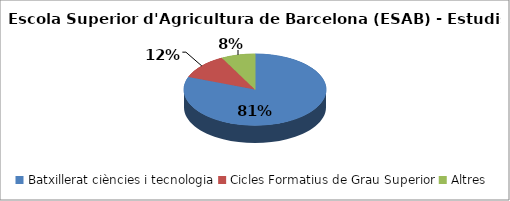
| Category | Escola Superior d'Agricultura de Barcelona (ESAB) - Estudis cursats |
|---|---|
| Batxillerat ciències i tecnologia | 0.808 |
| Cicles Formatius de Grau Superior | 0.115 |
| Altres | 0.077 |